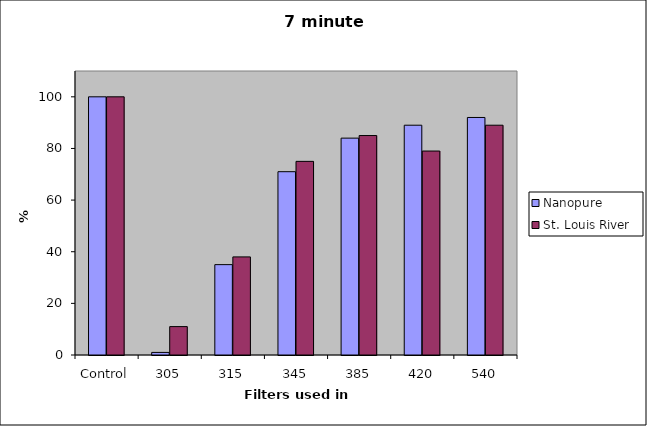
| Category | Nanopure | St. Louis River |
|---|---|---|
| Control | 100 | 100 |
| 305 | 1 | 11 |
| 315 | 35 | 38 |
| 345 | 71 | 75 |
| 385 | 84 | 85 |
| 420 | 89 | 79 |
| 540 | 92 | 89 |